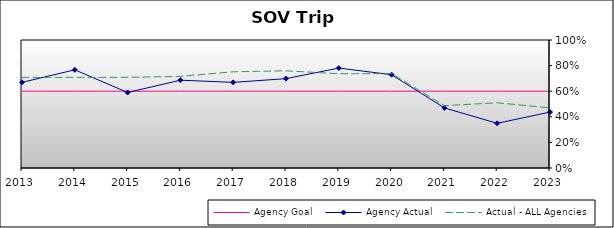
| Category | Agency Goal | Agency Actual | Actual - ALL Agencies |
|---|---|---|---|
| 2013.0 | 0.6 | 0.669 | 0.708 |
| 2014.0 | 0.6 | 0.767 | 0.708 |
| 2015.0 | 0.6 | 0.59 | 0.708 |
| 2016.0 | 0.6 | 0.686 | 0.716 |
| 2017.0 | 0.6 | 0.669 | 0.752 |
| 2018.0 | 0.6 | 0.698 | 0.759 |
| 2019.0 | 0.6 | 0.781 | 0.736 |
| 2020.0 | 0.6 | 0.729 | 0.737 |
| 2021.0 | 0.6 | 0.47 | 0.487 |
| 2022.0 | 0.6 | 0.349 | 0.509 |
| 2023.0 | 0.6 | 0.437 | 0.47 |